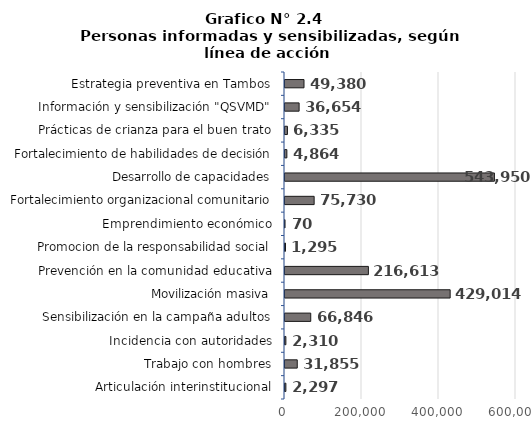
| Category | Series 0 |
|---|---|
| Articulación interinstitucional | 2297 |
| Trabajo con hombres | 31855 |
| Incidencia con autoridades | 2310 |
| Sensibilización en la campaña adultos | 66846 |
| Movilización masiva | 429014 |
| Prevención en la comunidad educativa | 216613 |
| Promocion de la responsabilidad social | 1295 |
| Emprendimiento económico | 70 |
| Fortalecimiento organizacional comunitario | 75730 |
| Desarrollo de capacidades | 543950 |
| Fortalecimiento de habilidades de decisión | 4864 |
| Prácticas de crianza para el buen trato | 6335 |
| Información y sensibilización "QSVMD" | 36654 |
| Estrategia preventiva en Tambos | 49380 |